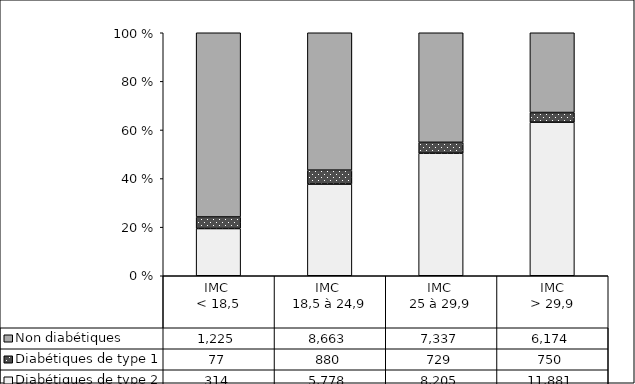
| Category | Diabétiques de type 2 | Diabétiques de type 1 | Non diabétiques |
|---|---|---|---|
| IMC 
< 18,5 | 314 | 77 | 1225 |
| IMC 
18,5 à 24,9 | 5778 | 880 | 8663 |
| IMC 
25 à 29,9 | 8205 | 729 | 7337 |
| IMC
> 29,9 | 11881 | 750 | 6174 |